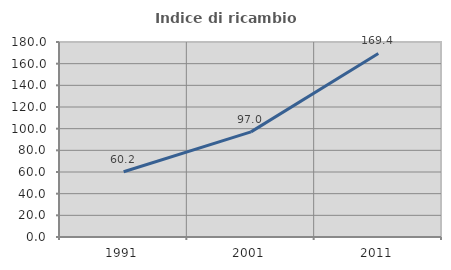
| Category | Indice di ricambio occupazionale  |
|---|---|
| 1991.0 | 60.234 |
| 2001.0 | 97.024 |
| 2011.0 | 169.427 |